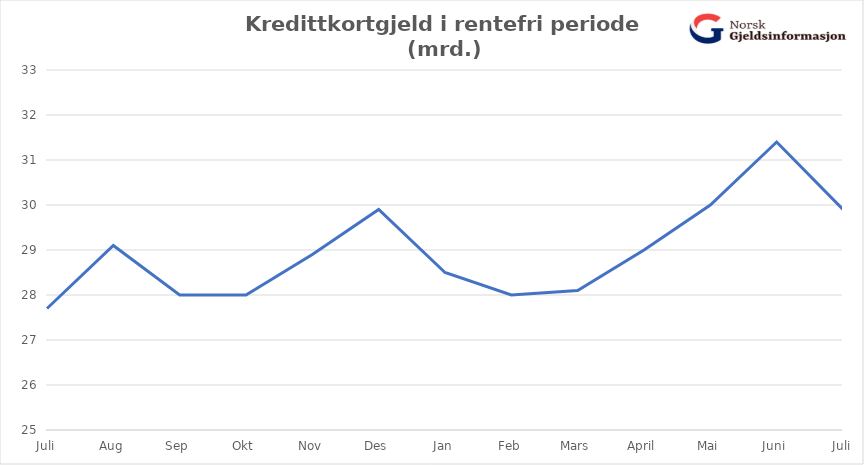
| Category | Ikke-rentebærende rammekreditt | Rentebærende rammekreditt |
|---|---|---|
| Juli | 27.7 |  |
| Aug | 29.1 |  |
| Sep | 28 |  |
| Okt | 28 |  |
| Nov | 28.9 |  |
| Des | 29.9 |  |
| Jan | 28.5 |  |
| Feb | 28 |  |
| Mars | 28.1 |  |
| April | 29 |  |
| Mai | 30 |  |
| Juni | 31.4 |  |
| Juli | 29.9 |  |